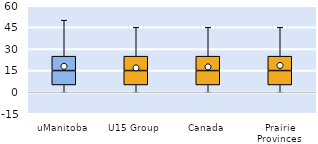
| Category | 25th | 50th | 75th |
|---|---|---|---|
| uManitoba | 5 | 10 | 10 |
| U15 Group | 5 | 10 | 10 |
| Canada | 5 | 10 | 10 |
| Prairie Provinces | 5 | 10 | 10 |